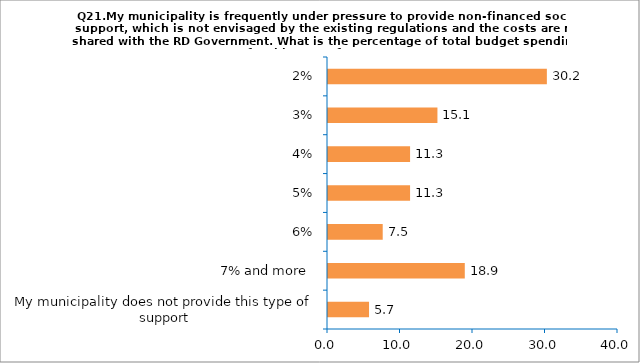
| Category | Series 0 |
|---|---|
| My municipality does not provide this type of support | 5.66 |
| 7% and more  | 18.868 |
| 6% | 7.547 |
| 5% | 11.321 |
| 4% | 11.321 |
| 3% | 15.094 |
| 2% | 30.189 |